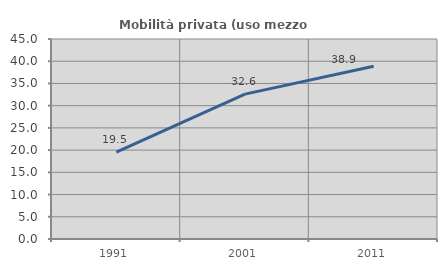
| Category | Mobilità privata (uso mezzo privato) |
|---|---|
| 1991.0 | 19.546 |
| 2001.0 | 32.6 |
| 2011.0 | 38.884 |